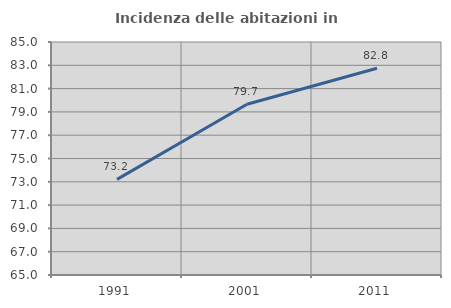
| Category | Incidenza delle abitazioni in proprietà  |
|---|---|
| 1991.0 | 73.212 |
| 2001.0 | 79.661 |
| 2011.0 | 82.75 |